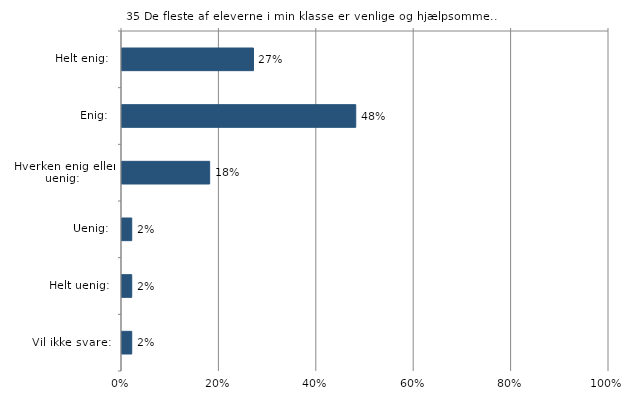
| Category | De fleste af eleverne i min klasse er venlige og hjælpsomme. |
|---|---|
| Helt enig:  | 0.27 |
| Enig:  | 0.48 |
| Hverken enig eller uenig:  | 0.18 |
| Uenig:  | 0.02 |
| Helt uenig:  | 0.02 |
| Vil ikke svare:  | 0.02 |